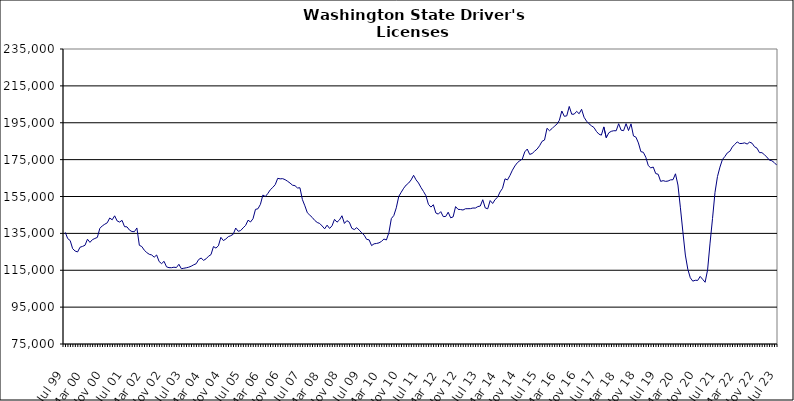
| Category | Series 0 |
|---|---|
| Jul 99 | 135560 |
| Aug 99 | 132182 |
| Sep 99 | 131104 |
| Oct 99 | 126694 |
| Nov 99 | 125425 |
| Dec 99 | 124927 |
| Jan 00 | 127499 |
| Feb 00 | 127927 |
| Mar 00 | 128547 |
| Apr 00 | 131834 |
| May 00 | 130120 |
| Jun 00 | 131595 |
| Jul 00 | 132236 |
| Aug 00 | 132819 |
| Sep 00 | 137711 |
| Oct 00 | 139063 |
| Nov 00 | 139952 |
| Dec 00 | 140732 |
| Jan 01 | 143338 |
| Feb 01 | 142359 |
| Mar 01 | 144523 |
| Apr 01 | 141758 |
| May 01 | 141135 |
| Jun 01 | 142064 |
| Jul 01 | 138646 |
| Aug 01 | 138530 |
| Sep 01 | 136784 |
| Oct 01 | 135996 |
| Nov 01 | 135917 |
| Dec 01 | 137940 |
| Jan 02 | 128531 |
| Feb 02 | 127848 |
| Mar 02 | 125876 |
| Apr 02 | 124595 |
| May 02 | 123660 |
| Jun 02 | 123282 |
| Jul 02 | 122089 |
| Aug 02 | 123279 |
| Sep 02 | 119727 |
| Oct 02 | 118588 |
| Nov 02 | 119854 |
| Dec 02 | 116851 |
| Jan 03 | 116407 |
| Feb 03 | 116382 |
| Mar 03 | 116648 |
| Apr 03 | 116471 |
| May 03 | 118231 |
| Jun 03 | 115831 |
| Jul 03 | 116082 |
| Aug 03 | 116341 |
| Sep 03 | 116653 |
| Oct 03 | 117212 |
| Nov 03 | 117962 |
| Dec 03 | 118542 |
| Jan 04 | 120817 |
| Feb 04 | 121617 |
| Mar 04 | 120369 |
| Apr 04 | 121200 |
| May 04 | 122609 |
| Jun 04 | 123484 |
| Jul 04 | 127844 |
| Aug 04 | 127025 |
| Sep 04 | 128273 |
| Oct 04 | 132853 |
| Nov 04 | 131106 |
| Dec 04 | 131935 |
| Jan 05 | 133205 |
| Feb 05 | 133736 |
| Mar 05 | 134528 |
| Apr 05 | 137889 |
| May 05 | 136130 |
| Jun 05 | 136523 |
| Jul 05 | 137997 |
| Aug 05 | 139294 |
| Sep 05 | 142140 |
| Oct 05 | 141192 |
| Nov 05 | 142937 |
| Dec 05 | 148013 |
| Jan 06 | 148341 |
| Feb 06 | 150744 |
| Mar 06 | 155794 |
| Apr 06 | 154984 |
| May 06 | 156651 |
| Jun 06 | 158638 |
| Jul 06 | 159911 |
| Aug 06 | 161445 |
| Sep 06 | 164852 |
| Oct 06 | 164570 |
| Nov 06 | 164679 |
| Dec 06 | 164127 |
| Jan 07 | 163271 |
| Feb 07 | 162273 |
| Mar 07 | 161140 |
| Apr 07 | 160860 |
| May 07 | 159633 |
| Jun 07 | 159724 |
| Jul 07 | 153303 |
| Aug 07 | 149939 |
| Sep 07 | 146172 |
| Oct 07 | 144876 |
| Nov 07 | 143613 |
| Dec 07 | 142022 |
| Jan 08 | 140909 |
| Feb 08 | 140368 |
| Mar 08 | 138998 |
| Apr 08 | 137471 |
| May 08 | 139453 |
| Jun 08 | 137680 |
| Jul 08 | 139120 |
| Aug 08 | 142612 |
| Sep-08 | 141071 |
| Oct 08 | 142313 |
| Nov 08 | 144556 |
| Dec 08 | 140394 |
| Jan 09 | 141903 |
| Feb 09 | 141036 |
| Mar 09 | 137751 |
| Apr 09 | 137060 |
| May 09 | 138101 |
| Jun 09 | 136739 |
| Jul 09 | 135317 |
| Aug 09 | 134020 |
| Sep 09 | 131756 |
| Oct 09 | 131488 |
| Nov 09 | 128370 |
| Dec 09 | 129323 |
| Jan 10 | 129531 |
| Feb 10 | 129848 |
| Mar 10 | 130654 |
| Apr 10 | 131929 |
| May 10 | 131429 |
| Jun 10 | 135357 |
| Jul 10 | 143032 |
| Aug 10 | 144686 |
| Sep 10 | 148856 |
| Oct 10 | 155042 |
| Nov 10 | 157328 |
| Dec 10 | 159501 |
| Jan 11 | 161221 |
| Feb 11 | 162312 |
| Mar 11 | 163996 |
| Apr 11 | 166495 |
| May 11 | 164040 |
| Jun 11 | 162324 |
| Jul 11 | 159862 |
| Aug 11 | 157738 |
| Sep 11 | 155430 |
| Oct 11 | 150762 |
| Nov 11 | 149255 |
| Dec 11 | 150533 |
| Jan 12 | 146068 |
| Feb 12 | 145446 |
| Mar 12 | 146788 |
| Apr 12 | 144110 |
| May 12 | 144162 |
| Jun 12 | 146482 |
| Jul 12 | 143445 |
| Aug 12 | 143950 |
| Sep 12 | 149520 |
| Oct 12 | 148033 |
| Nov 12 | 147926 |
| Dec 12 | 147674 |
| Jan 13 | 148360 |
| Feb-13 | 148388 |
| Mar-13 | 148414 |
| Apr 13 | 148749 |
| May 13 | 148735 |
| Jun-13 | 149521 |
| Jul 13 | 149837 |
| Aug 13 | 153252 |
| Sep 13 | 148803 |
| Oct 13 | 148315 |
| Nov 13 | 152804 |
| Dec 13 | 151209 |
| Jan 14 | 153357 |
| Feb-14 | 154608 |
| Mar 14 | 157479 |
| Apr 14 | 159441 |
| May 14 | 164591 |
| Jun 14 | 163995 |
| Jul-14 | 166411 |
| Aug-14 | 169272 |
| Sep 14 | 171565 |
| Oct 14 | 173335 |
| Nov 14 | 174406 |
| Dec 14 | 175302 |
| Jan 15 | 179204 |
| Feb 15 | 180737 |
| Mar 15 | 177810 |
| Apr-15 | 178331 |
| May 15 | 179601 |
| Jun-15 | 180729 |
| Jul 15 | 182540 |
| Aug 15 | 184924 |
| Sep 15 | 185620 |
| Oct 15 | 192002 |
| Nov 15 | 190681 |
| Dec 15 | 191795 |
| Jan 16 | 193132 |
| Feb 16 | 194206 |
| Mar 16 | 196319 |
| Apr 16 | 201373 |
| May 16 | 198500 |
| Jun 16 | 198743 |
| Jul 16 | 203841 |
| Aug 16 | 199630 |
| Sep 16 | 199655 |
| Oct 16 | 201181 |
| Nov 16 | 199888 |
| Dec 16 | 202304 |
| Jan 17 | 197977 |
| Feb 17 | 195889 |
| Mar 17 | 194438 |
| Apr 17 | 193335 |
| May 17 | 192430 |
| Jun 17 | 190298 |
| Jul 17 | 188832 |
| Aug 17 | 188264 |
| Sep 17 | 192738 |
| Oct 17 | 186856 |
| Nov 17 | 189537 |
| Dec 17 | 190341 |
| Jan 18 | 190670 |
| Feb 18 | 190645 |
| Mar 18 | 194476 |
| Apr 18 | 190971 |
| May 18 | 190707 |
| Jun 18 | 194516 |
| Jul 18 | 190783 |
| Aug 18 | 194390 |
| Sep 18 | 187831 |
| Oct 18 | 187188 |
| Nov 18 | 184054 |
| Dec 18 | 179347 |
| Jan 19 | 178958 |
| Feb 19 | 176289 |
| Mar 19 | 171747 |
| Apr 19 | 170532 |
| May 19 | 170967 |
| Jun 19 | 167444 |
| Jul 19 | 167059 |
| Aug 19 | 163194 |
| Sep 19 | 163599 |
| Oct 19 | 163212 |
| Nov 19 | 163388 |
| Dec 19 | 164024 |
| Jan 20 | 164114 |
| Feb 20 | 167320 |
| Mar 20 | 161221 |
| Apr 20 | 148866 |
| May 20 | 135821 |
| Jun 20 | 123252 |
| Jul 20 | 115526 |
| Aug 20 | 110940 |
| Sep 20 | 109099 |
| Oct 20 | 109566 |
| Nov 20 | 109488 |
| Dec 20 | 111658 |
| Jan 21 | 110070 |
| Feb 21 | 108491 |
| Mar 21 | 115176 |
| Apr 21 | 129726 |
| May 21 | 143052 |
| Jun 21 | 157253 |
| Jul 21 | 165832 |
| Aug 21 | 170937 |
| Sep 21 | 175042 |
| Oct 21 | 176696 |
| Nov 21 | 178677 |
| Dec 21 | 179501 |
| Jan 22 | 181825 |
| Feb 22 | 183258 |
| Mar 22 | 184618 |
| Apr 22 | 183710 |
| May 22 | 183784 |
| Jun 22 | 184101 |
| Jul 22 | 183443 |
| Aug 22 | 184475 |
| Sep 22 | 183902 |
| Oct 22 | 181994 |
| Nov 22 | 181207 |
| Dec 22 | 178793 |
| Jan 23 | 178782 |
| Feb 23 | 177647 |
| Mar 23 | 176386 |
| Apr 23 | 174729 |
| May 23 | 174390 |
| Jun 23 | 173391 |
| Jul 23 | 171988 |